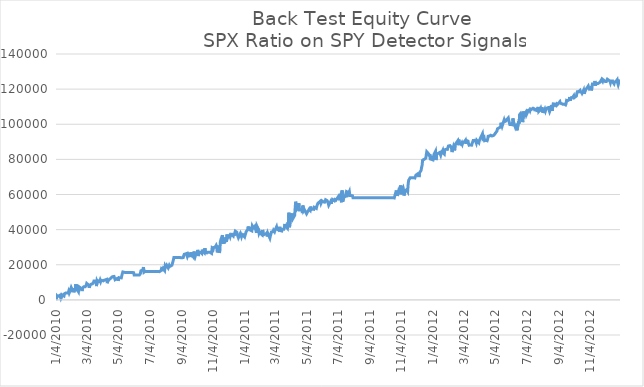
| Category | Series 0 |
|---|---|
| 1/4/10 | -181.5 |
| 1/5/10 | 2499 |
| 1/6/10 | 2489 |
| 1/7/10 | 1964 |
| 1/8/10 | 2178 |
| 1/11/10 | 2622 |
| 1/12/10 | 2304 |
| 1/13/10 | 760 |
| 1/14/10 | 1355 |
| 1/15/10 | 2938 |
| 1/19/10 | 2198 |
| 1/20/10 | 3500 |
| 1/21/10 | 3850 |
| 1/22/10 | 3850 |
| 1/25/10 | 3850 |
| 1/26/10 | 3709 |
| 1/27/10 | 3849 |
| 1/28/10 | 4809 |
| 1/29/10 | 3899 |
| 2/1/10 | 6139 |
| 2/2/10 | 7044 |
| 2/3/10 | 6419 |
| 2/4/10 | 5078 |
| 2/5/10 | 5078 |
| 2/8/10 | 4931 |
| 2/9/10 | 6716 |
| 2/10/10 | 4936 |
| 2/11/10 | 8906 |
| 2/12/10 | 6581 |
| 2/16/10 | 4646 |
| 2/17/10 | 7473 |
| 2/18/10 | 7063 |
| 2/19/10 | 7038 |
| 2/22/10 | 5933 |
| 2/23/10 | 5023 |
| 2/24/10 | 6753 |
| 2/25/10 | 6818 |
| 2/26/10 | 7418 |
| 3/1/10 | 7453 |
| 3/2/10 | 7653 |
| 3/3/10 | 8323 |
| 3/4/10 | 9388 |
| 3/5/10 | 9266 |
| 3/8/10 | 8358 |
| 3/9/10 | 6873 |
| 3/10/10 | 8051 |
| 3/11/10 | 8517 |
| 3/12/10 | 8822 |
| 3/15/10 | 9127 |
| 3/16/10 | 9267 |
| 3/17/10 | 9837 |
| 3/18/10 | 10742 |
| 3/19/10 | 10449 |
| 3/22/10 | 10804 |
| 3/23/10 | 7839 |
| 3/24/10 | 10759 |
| 3/25/10 | 10169 |
| 3/26/10 | 10876 |
| 3/29/10 | 10398 |
| 3/30/10 | 11233 |
| 3/31/10 | 10398 |
| 4/1/10 | 11215 |
| 4/5/10 | 10825 |
| 4/6/10 | 10985 |
| 4/7/10 | 11230 |
| 4/8/10 | 11115 |
| 4/9/10 | 11392 |
| 4/12/10 | 11715 |
| 4/13/10 | 9492 |
| 4/14/10 | 10845 |
| 4/15/10 | 11330 |
| 4/16/10 | 11402 |
| 4/19/10 | 12182 |
| 4/20/10 | 11767 |
| 4/21/10 | 12772 |
| 4/22/10 | 12712 |
| 4/23/10 | 13192 |
| 4/26/10 | 13337 |
| 4/27/10 | 12872 |
| 4/28/10 | 11522 |
| 4/29/10 | 11852 |
| 4/30/10 | 11962 |
| 5/3/10 | 12312 |
| 5/4/10 | 10857 |
| 5/5/10 | 11967 |
| 5/6/10 | 12657 |
| 5/7/10 | 12522 |
| 5/10/10 | 12522 |
| 5/11/10 | 12370 |
| 5/12/10 | 14925 |
| 5/13/10 | 15901 |
| 5/14/10 | 15561 |
| 5/17/10 | 15618 |
| 5/18/10 | 15618 |
| 5/19/10 | 15618 |
| 5/20/10 | 15618 |
| 5/21/10 | 15618 |
| 5/24/10 | 15618 |
| 5/25/10 | 15618 |
| 5/26/10 | 15618 |
| 5/27/10 | 15618 |
| 5/28/10 | 15618 |
| 6/1/10 | 15618 |
| 6/2/10 | 15618 |
| 6/3/10 | 15459 |
| 6/4/10 | 14118 |
| 6/7/10 | 14118 |
| 6/8/10 | 14118 |
| 6/9/10 | 14118 |
| 6/10/10 | 14118 |
| 6/11/10 | 14118 |
| 6/14/10 | 14118 |
| 6/15/10 | 13968 |
| 6/16/10 | 14918 |
| 6/17/10 | 16518 |
| 6/18/10 | 16568 |
| 6/21/10 | 17218 |
| 6/22/10 | 18668 |
| 6/23/10 | 15768 |
| 6/24/10 | 16218 |
| 6/25/10 | 16218 |
| 6/28/10 | 16218 |
| 6/29/10 | 16218 |
| 6/30/10 | 16218 |
| 7/1/10 | 16218 |
| 7/2/10 | 16218 |
| 7/6/10 | 16218 |
| 7/7/10 | 16218 |
| 7/8/10 | 16218 |
| 7/9/10 | 16218 |
| 7/12/10 | 16218 |
| 7/13/10 | 16218 |
| 7/14/10 | 16218 |
| 7/15/10 | 16218 |
| 7/16/10 | 16218 |
| 7/19/10 | 16218 |
| 7/20/10 | 16218 |
| 7/21/10 | 16218 |
| 7/22/10 | 16218 |
| 7/23/10 | 16074 |
| 7/26/10 | 16674 |
| 7/27/10 | 17774 |
| 7/28/10 | 17414 |
| 7/29/10 | 17314 |
| 7/30/10 | 17956 |
| 8/2/10 | 16736 |
| 8/3/10 | 19238 |
| 8/4/10 | 18638 |
| 8/5/10 | 19058 |
| 8/6/10 | 19740 |
| 8/9/10 | 18182 |
| 8/10/10 | 18884 |
| 8/11/10 | 19634 |
| 8/12/10 | 19024 |
| 8/13/10 | 19134 |
| 8/16/10 | 19694 |
| 8/17/10 | 20594 |
| 8/18/10 | 21594 |
| 8/19/10 | 22794 |
| 8/20/10 | 24122 |
| 8/23/10 | 24122 |
| 8/24/10 | 24122 |
| 8/25/10 | 24122 |
| 8/26/10 | 24122 |
| 8/27/10 | 24122 |
| 8/30/10 | 24122 |
| 8/31/10 | 24122 |
| 9/1/10 | 24122 |
| 9/2/10 | 24122 |
| 9/3/10 | 23957 |
| 9/7/10 | 24067 |
| 9/8/10 | 25157 |
| 9/9/10 | 25947 |
| 9/10/10 | 25902 |
| 9/13/10 | 26352 |
| 9/14/10 | 26445 |
| 9/15/10 | 24612 |
| 9/16/10 | 25372 |
| 9/17/10 | 26202 |
| 9/20/10 | 25132 |
| 9/21/10 | 24362 |
| 9/22/10 | 27075 |
| 9/23/10 | 27392 |
| 9/24/10 | 25462 |
| 9/27/10 | 24332 |
| 9/28/10 | 27549 |
| 9/29/10 | 25224 |
| 9/30/10 | 24556 |
| 10/1/10 | 25661 |
| 10/4/10 | 26136 |
| 10/5/10 | 28468 |
| 10/6/10 | 24950 |
| 10/7/10 | 26475 |
| 10/8/10 | 27200 |
| 10/11/10 | 26950 |
| 10/12/10 | 27487 |
| 10/13/10 | 26422 |
| 10/14/10 | 28615 |
| 10/15/10 | 27750 |
| 10/18/10 | 26840 |
| 10/19/10 | 29432 |
| 10/20/10 | 27492 |
| 10/21/10 | 26092 |
| 10/22/10 | 26992 |
| 10/25/10 | 27092 |
| 10/26/10 | 26992 |
| 10/27/10 | 27074 |
| 10/28/10 | 27014 |
| 10/29/10 | 27114 |
| 11/1/10 | 26496 |
| 11/2/10 | 29296 |
| 11/3/10 | 29596 |
| 11/4/10 | 28646 |
| 11/5/10 | 29847 |
| 11/8/10 | 29987 |
| 11/9/10 | 30057 |
| 11/10/10 | 31064 |
| 11/11/10 | 30329 |
| 11/12/10 | 27049 |
| 11/15/10 | 30864 |
| 11/16/10 | 26884 |
| 11/17/10 | 27506 |
| 11/18/10 | 33091 |
| 11/19/10 | 34316 |
| 11/22/10 | 36841 |
| 11/23/10 | 31838 |
| 11/24/10 | 34838 |
| 11/26/10 | 32273 |
| 11/29/10 | 35585 |
| 11/30/10 | 33080 |
| 12/1/10 | 37173 |
| 12/2/10 | 35313 |
| 12/3/10 | 35533 |
| 12/6/10 | 36833 |
| 12/7/10 | 36015 |
| 12/8/10 | 37107 |
| 12/9/10 | 36767 |
| 12/10/10 | 37312 |
| 12/13/10 | 36377 |
| 12/14/10 | 37884 |
| 12/15/10 | 36569 |
| 12/16/10 | 38059 |
| 12/17/10 | 39134 |
| 12/20/10 | 38484 |
| 12/21/10 | 37014 |
| 12/22/10 | 36759 |
| 12/23/10 | 35379 |
| 12/27/10 | 37934 |
| 12/28/10 | 37279 |
| 12/29/10 | 36194 |
| 12/30/10 | 37184 |
| 12/31/10 | 37304 |
| 1/3/11 | 36095 |
| 1/4/11 | 37845 |
| 1/5/11 | 36845 |
| 1/6/11 | 37377 |
| 1/7/11 | 38817 |
| 1/10/11 | 40057 |
| 1/11/11 | 41747 |
| 1/12/11 | 40237 |
| 1/13/11 | 41537 |
| 1/14/11 | 39892 |
| 1/18/11 | 39282 |
| 1/19/11 | 42077 |
| 1/20/11 | 42377 |
| 1/21/11 | 41057 |
| 1/24/11 | 41992 |
| 1/25/11 | 40492 |
| 1/26/11 | 39402 |
| 1/27/11 | 38162 |
| 1/28/11 | 41932 |
| 1/31/11 | 40127 |
| 2/1/11 | 38062 |
| 2/2/11 | 38747 |
| 2/3/11 | 38009 |
| 2/4/11 | 38449 |
| 2/7/11 | 36989 |
| 2/8/11 | 39834 |
| 2/9/11 | 37736 |
| 2/10/11 | 37114 |
| 2/11/11 | 37244 |
| 2/14/11 | 37531 |
| 2/15/11 | 37406 |
| 2/16/11 | 38078 |
| 2/17/11 | 36106 |
| 2/18/11 | 37886 |
| 2/22/11 | 35158 |
| 2/23/11 | 36463 |
| 2/24/11 | 35908 |
| 2/25/11 | 38637 |
| 2/28/11 | 38845 |
| 3/1/11 | 39637 |
| 3/2/11 | 39631 |
| 3/3/11 | 38769 |
| 3/4/11 | 39699 |
| 3/7/11 | 41641 |
| 3/8/11 | 40370 |
| 3/9/11 | 40532 |
| 3/10/11 | 39902 |
| 3/11/11 | 40992 |
| 3/14/11 | 40992 |
| 3/15/11 | 39384 |
| 3/16/11 | 39384 |
| 3/17/11 | 39213 |
| 3/18/11 | 40198 |
| 3/21/11 | 40168 |
| 3/22/11 | 40978 |
| 3/23/11 | 43233 |
| 3/24/11 | 42010 |
| 3/25/11 | 42237 |
| 3/28/11 | 40759 |
| 3/29/11 | 44239 |
| 3/30/11 | 42962 |
| 3/31/11 | 49622 |
| 4/1/11 | 41392 |
| 4/4/11 | 48972 |
| 4/5/11 | 47082 |
| 4/6/11 | 47842 |
| 4/7/11 | 49222 |
| 4/8/11 | 46542 |
| 4/11/11 | 48132 |
| 4/12/11 | 52362 |
| 4/13/11 | 55892 |
| 4/14/11 | 53772 |
| 4/15/11 | 51362 |
| 4/18/11 | 52372 |
| 4/19/11 | 55142 |
| 4/20/11 | 51194 |
| 4/21/11 | 51114 |
| 4/25/11 | 51214 |
| 4/26/11 | 49396 |
| 4/27/11 | 53706 |
| 4/28/11 | 51236 |
| 4/29/11 | 51896 |
| 5/2/11 | 50150 |
| 5/3/11 | 49750 |
| 5/4/11 | 49035 |
| 5/5/11 | 49610 |
| 5/6/11 | 49255 |
| 5/9/11 | 51560 |
| 5/10/11 | 51230 |
| 5/11/11 | 50945 |
| 5/12/11 | 53140 |
| 5/13/11 | 51370 |
| 5/16/11 | 51744 |
| 5/17/11 | 51744 |
| 5/18/11 | 51591 |
| 5/19/11 | 52716 |
| 5/20/11 | 52466 |
| 5/23/11 | 52081 |
| 5/24/11 | 53401 |
| 5/25/11 | 53828 |
| 5/26/11 | 54953 |
| 5/27/11 | 55203 |
| 5/31/11 | 56253 |
| 6/1/11 | 54985 |
| 6/2/11 | 54455 |
| 6/3/11 | 56355 |
| 6/6/11 | 55792 |
| 6/7/11 | 55639 |
| 6/8/11 | 55634 |
| 6/9/11 | 56214 |
| 6/10/11 | 57009 |
| 6/13/11 | 56504 |
| 6/14/11 | 56451 |
| 6/15/11 | 55058 |
| 6/16/11 | 53878 |
| 6/17/11 | 53548 |
| 6/20/11 | 56093 |
| 6/21/11 | 54623 |
| 6/22/11 | 57428 |
| 6/23/11 | 55958 |
| 6/24/11 | 57033 |
| 6/27/11 | 56418 |
| 6/28/11 | 57110 |
| 6/29/11 | 56710 |
| 6/30/11 | 56753 |
| 7/1/11 | 56781 |
| 7/5/11 | 58928 |
| 7/6/11 | 58153 |
| 7/7/11 | 57603 |
| 7/8/11 | 59278 |
| 7/11/11 | 55553 |
| 7/12/11 | 62253 |
| 7/13/11 | 55878 |
| 7/14/11 | 55860 |
| 7/15/11 | 57987 |
| 7/18/11 | 59087 |
| 7/19/11 | 60187 |
| 7/20/11 | 60137 |
| 7/21/11 | 58437 |
| 7/22/11 | 61475 |
| 7/25/11 | 61062 |
| 7/26/11 | 61714 |
| 7/27/11 | 59429 |
| 7/28/11 | 59429 |
| 7/29/11 | 59429 |
| 8/1/11 | 59276 |
| 8/2/11 | 58179 |
| 8/3/11 | 58179 |
| 8/4/11 | 58179 |
| 8/5/11 | 58179 |
| 8/8/11 | 58179 |
| 8/9/11 | 58179 |
| 8/10/11 | 58179 |
| 8/11/11 | 58179 |
| 8/12/11 | 58179 |
| 8/15/11 | 58179 |
| 8/16/11 | 58179 |
| 8/17/11 | 58179 |
| 8/18/11 | 58179 |
| 8/19/11 | 58179 |
| 8/22/11 | 58179 |
| 8/23/11 | 58179 |
| 8/24/11 | 58179 |
| 8/25/11 | 58179 |
| 8/26/11 | 58179 |
| 8/29/11 | 58179 |
| 8/30/11 | 58179 |
| 8/31/11 | 58179 |
| 9/1/11 | 58179 |
| 9/2/11 | 58179 |
| 9/6/11 | 58179 |
| 9/7/11 | 58179 |
| 9/8/11 | 58179 |
| 9/9/11 | 58179 |
| 9/12/11 | 58179 |
| 9/13/11 | 58179 |
| 9/14/11 | 58179 |
| 9/15/11 | 58179 |
| 9/16/11 | 58179 |
| 9/19/11 | 58179 |
| 9/20/11 | 58179 |
| 9/21/11 | 58179 |
| 9/22/11 | 58179 |
| 9/23/11 | 58179 |
| 9/26/11 | 58179 |
| 9/27/11 | 58179 |
| 9/28/11 | 58179 |
| 9/29/11 | 58179 |
| 9/30/11 | 58179 |
| 10/3/11 | 58179 |
| 10/4/11 | 58179 |
| 10/5/11 | 58179 |
| 10/6/11 | 58179 |
| 10/7/11 | 58179 |
| 10/10/11 | 58179 |
| 10/11/11 | 58179 |
| 10/12/11 | 58179 |
| 10/13/11 | 58179 |
| 10/14/11 | 58179 |
| 10/17/11 | 58179 |
| 10/18/11 | 58179 |
| 10/19/11 | 58179 |
| 10/20/11 | 58179 |
| 10/21/11 | 58026 |
| 10/24/11 | 61179 |
| 10/25/11 | 62304 |
| 10/26/11 | 61046 |
| 10/27/11 | 59246 |
| 10/28/11 | 60176 |
| 10/31/11 | 63833 |
| 11/1/11 | 61123 |
| 11/2/11 | 65118 |
| 11/3/11 | 60093 |
| 11/4/11 | 62723 |
| 11/7/11 | 64108 |
| 11/8/11 | 62850 |
| 11/9/11 | 59415 |
| 11/10/11 | 59600 |
| 11/11/11 | 61960 |
| 11/14/11 | 62827 |
| 11/15/11 | 62917 |
| 11/16/11 | 61787 |
| 11/17/11 | 66032 |
| 11/18/11 | 68161 |
| 11/21/11 | 69567 |
| 11/22/11 | 69567 |
| 11/23/11 | 69567 |
| 11/25/11 | 69567 |
| 11/28/11 | 69567 |
| 11/29/11 | 69567 |
| 11/30/11 | 69399 |
| 12/1/11 | 69149 |
| 12/2/11 | 71051 |
| 12/5/11 | 71651 |
| 12/6/11 | 71101 |
| 12/7/11 | 70751 |
| 12/8/11 | 69933 |
| 12/9/11 | 72383 |
| 12/12/11 | 73693 |
| 12/13/11 | 75433 |
| 12/14/11 | 76583 |
| 12/15/11 | 79533 |
| 12/16/11 | 79403 |
| 12/19/11 | 80195 |
| 12/20/11 | 80033 |
| 12/21/11 | 80655 |
| 12/22/11 | 82435 |
| 12/23/11 | 84335 |
| 12/27/11 | 82995 |
| 12/28/11 | 81817 |
| 12/29/11 | 82899 |
| 12/30/11 | 80221 |
| 1/3/12 | 79801 |
| 1/4/12 | 81981 |
| 1/5/12 | 81251 |
| 1/6/12 | 82831 |
| 1/9/12 | 84571 |
| 1/10/12 | 79600 |
| 1/11/12 | 82755 |
| 1/12/12 | 82665 |
| 1/13/12 | 83250 |
| 1/17/12 | 83912 |
| 1/18/12 | 83557 |
| 1/19/12 | 82392 |
| 1/20/12 | 83522 |
| 1/23/12 | 85189 |
| 1/24/12 | 83579 |
| 1/25/12 | 83954 |
| 1/26/12 | 82997 |
| 1/27/12 | 85507 |
| 1/30/12 | 85752 |
| 1/31/12 | 86304 |
| 2/1/12 | 85701 |
| 2/2/12 | 85577 |
| 2/3/12 | 87622 |
| 2/6/12 | 87822 |
| 2/7/12 | 88017 |
| 2/8/12 | 87137 |
| 2/9/12 | 86332 |
| 2/10/12 | 84169 |
| 2/13/12 | 87464 |
| 2/14/12 | 86664 |
| 2/15/12 | 85124 |
| 2/16/12 | 88397 |
| 2/17/12 | 88759 |
| 2/21/12 | 90529 |
| 2/22/12 | 88091 |
| 2/23/12 | 91266 |
| 2/24/12 | 89476 |
| 2/27/12 | 88666 |
| 2/28/12 | 89196 |
| 2/29/12 | 89571 |
| 3/1/12 | 88736 |
| 3/2/12 | 89671 |
| 3/5/12 | 90051 |
| 3/6/12 | 90016 |
| 3/7/12 | 90861 |
| 3/8/12 | 88856 |
| 3/9/12 | 90771 |
| 3/12/12 | 90393 |
| 3/13/12 | 88937 |
| 3/14/12 | 88082 |
| 3/15/12 | 88492 |
| 3/16/12 | 88237 |
| 3/19/12 | 88097 |
| 3/20/12 | 89157 |
| 3/21/12 | 89912 |
| 3/22/12 | 90767 |
| 3/23/12 | 91017 |
| 3/26/12 | 90864 |
| 3/27/12 | 90692 |
| 3/28/12 | 89342 |
| 3/29/12 | 90842 |
| 3/30/12 | 90772 |
| 4/2/12 | 89471 |
| 4/3/12 | 90803 |
| 4/4/12 | 91461 |
| 4/5/12 | 91201 |
| 4/9/12 | 94566 |
| 4/10/12 | 91959 |
| 4/11/12 | 91806 |
| 4/12/12 | 92583 |
| 4/13/12 | 90640 |
| 4/16/12 | 90905 |
| 4/17/12 | 91410 |
| 4/18/12 | 90635 |
| 4/19/12 | 91510 |
| 4/20/12 | 93150 |
| 4/23/12 | 93365 |
| 4/24/12 | 93045 |
| 4/25/12 | 93720 |
| 4/26/12 | 93437 |
| 4/27/12 | 93312 |
| 4/30/12 | 93544 |
| 5/1/12 | 93759 |
| 5/2/12 | 94049 |
| 5/3/12 | 94559 |
| 5/4/12 | 94914 |
| 5/7/12 | 96134 |
| 5/8/12 | 97399 |
| 5/9/12 | 96944 |
| 5/10/12 | 97769 |
| 5/11/12 | 97374 |
| 5/14/12 | 98429 |
| 5/15/12 | 100866 |
| 5/16/12 | 100727 |
| 5/17/12 | 98867 |
| 5/18/12 | 98551 |
| 5/21/12 | 102467 |
| 5/22/12 | 101521 |
| 5/23/12 | 101251 |
| 5/24/12 | 101773 |
| 5/25/12 | 102359 |
| 5/29/12 | 103634 |
| 5/30/12 | 102119 |
| 5/31/12 | 102524 |
| 6/1/12 | 99852 |
| 6/4/12 | 99852 |
| 6/5/12 | 99852 |
| 6/6/12 | 99677 |
| 6/7/12 | 103349 |
| 6/8/12 | 101521 |
| 6/11/12 | 98902 |
| 6/12/12 | 100198 |
| 6/13/12 | 99119 |
| 6/14/12 | 99237 |
| 6/15/12 | 96524 |
| 6/18/12 | 101579 |
| 6/19/12 | 100413 |
| 6/20/12 | 105514 |
| 6/21/12 | 104954 |
| 6/22/12 | 106194 |
| 6/25/12 | 104239 |
| 6/26/12 | 101209 |
| 6/27/12 | 107248 |
| 6/28/12 | 107068 |
| 6/29/12 | 105074 |
| 7/2/12 | 106704 |
| 7/3/12 | 105349 |
| 7/5/12 | 106644 |
| 7/6/12 | 107836 |
| 7/9/12 | 108301 |
| 7/10/12 | 107691 |
| 7/11/12 | 108703 |
| 7/12/12 | 108550 |
| 7/13/12 | 108470 |
| 7/16/12 | 109130 |
| 7/17/12 | 108960 |
| 7/18/12 | 108820 |
| 7/19/12 | 108240 |
| 7/20/12 | 107945 |
| 7/23/12 | 108585 |
| 7/24/12 | 107005 |
| 7/25/12 | 109020 |
| 7/26/12 | 109855 |
| 7/27/12 | 107245 |
| 7/30/12 | 108215 |
| 7/31/12 | 108920 |
| 8/1/12 | 107790 |
| 8/2/12 | 109710 |
| 8/3/12 | 107274 |
| 8/6/12 | 107124 |
| 8/7/12 | 107804 |
| 8/8/12 | 108544 |
| 8/9/12 | 107624 |
| 8/10/12 | 108644 |
| 8/13/12 | 109374 |
| 8/14/12 | 109224 |
| 8/15/12 | 109504 |
| 8/16/12 | 108094 |
| 8/17/12 | 107194 |
| 8/20/12 | 109774 |
| 8/21/12 | 110894 |
| 8/22/12 | 107654 |
| 8/23/12 | 110044 |
| 8/24/12 | 111614 |
| 8/27/12 | 111464 |
| 8/28/12 | 110874 |
| 8/29/12 | 111124 |
| 8/30/12 | 111494 |
| 8/31/12 | 110844 |
| 9/4/12 | 112134 |
| 9/5/12 | 112526 |
| 9/6/12 | 112868 |
| 9/7/12 | 111960 |
| 9/10/12 | 111683 |
| 9/11/12 | 111908 |
| 9/12/12 | 111335 |
| 9/13/12 | 111204 |
| 9/14/12 | 111484 |
| 9/17/12 | 111004 |
| 9/18/12 | 111764 |
| 9/19/12 | 113604 |
| 9/20/12 | 113466 |
| 9/21/12 | 113446 |
| 9/24/12 | 113926 |
| 9/25/12 | 115496 |
| 9/26/12 | 113456 |
| 9/27/12 | 114018 |
| 9/28/12 | 115138 |
| 10/1/12 | 115378 |
| 10/2/12 | 115658 |
| 10/3/12 | 116298 |
| 10/4/12 | 115178 |
| 10/5/12 | 114680 |
| 10/8/12 | 116070 |
| 10/9/12 | 117870 |
| 10/10/12 | 118550 |
| 10/11/12 | 118352 |
| 10/12/12 | 118452 |
| 10/15/12 | 119252 |
| 10/16/12 | 118372 |
| 10/17/12 | 118094 |
| 10/18/12 | 118276 |
| 10/19/12 | 117676 |
| 10/22/12 | 119476 |
| 10/23/12 | 117376 |
| 10/24/12 | 117756 |
| 10/25/12 | 119186 |
| 10/26/12 | 119466 |
| 10/31/12 | 121756 |
| 11/1/12 | 120788 |
| 11/2/12 | 120170 |
| 11/5/12 | 120950 |
| 11/6/12 | 119270 |
| 11/7/12 | 120510 |
| 11/8/12 | 122882 |
| 11/9/12 | 122882 |
| 11/12/12 | 122729 |
| 11/13/12 | 124649 |
| 11/14/12 | 121964 |
| 11/15/12 | 123104 |
| 11/16/12 | 123382 |
| 11/19/12 | 123229 |
| 11/20/12 | 123609 |
| 11/21/12 | 123606 |
| 11/23/12 | 124006 |
| 11/26/12 | 125531 |
| 11/27/12 | 125056 |
| 11/28/12 | 124443 |
| 11/29/12 | 125306 |
| 11/30/12 | 124781 |
| 12/3/12 | 124281 |
| 12/4/12 | 124413 |
| 12/5/12 | 124310 |
| 12/6/12 | 124610 |
| 12/7/12 | 125647 |
| 12/10/12 | 124997 |
| 12/11/12 | 125015 |
| 12/12/12 | 124590 |
| 12/13/12 | 123647 |
| 12/14/12 | 124647 |
| 12/17/12 | 124682 |
| 12/18/12 | 123882 |
| 12/19/12 | 123907 |
| 12/20/12 | 123042 |
| 12/21/12 | 123972 |
| 12/24/12 | 124507 |
| 12/26/12 | 125312 |
| 12/27/12 | 123437 |
| 12/28/12 | 122487 |
| 12/31/12 | 125527 |